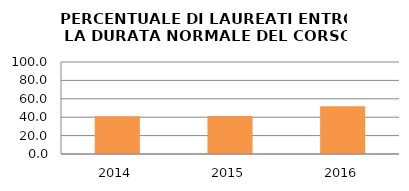
| Category | 2014 2015 2016 |
|---|---|
| 2014.0 | 40.909 |
| 2015.0 | 41.379 |
| 2016.0 | 52 |